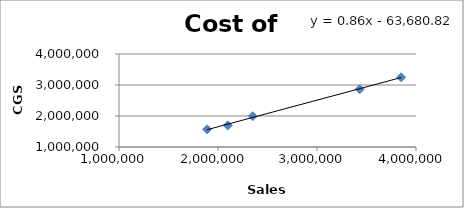
| Category | Cost of Goods |
|---|---|
| 1890532.0 | 1570200 |
| 2098490.0 | 1695694 |
| 2350308.0 | 1992400 |
| 3432000.0 | 2864000 |
| 3850000.0 | 3250000 |